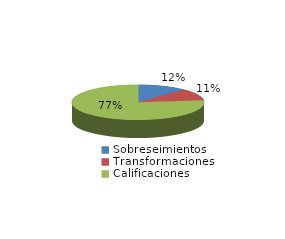
| Category | Series 0 |
|---|---|
| Sobreseimientos | 916 |
| Transformaciones | 841 |
| Calificaciones | 5857 |